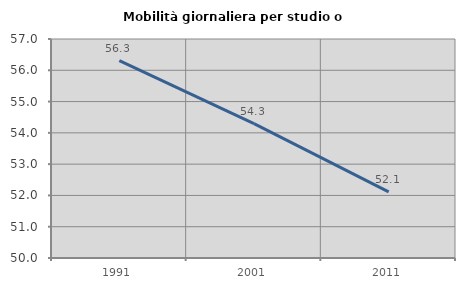
| Category | Mobilità giornaliera per studio o lavoro |
|---|---|
| 1991.0 | 56.309 |
| 2001.0 | 54.296 |
| 2011.0 | 52.113 |